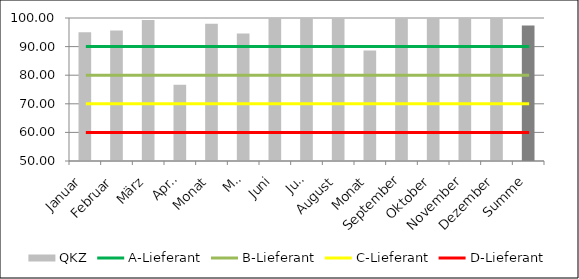
| Category | QKZ |
|---|---|
| Januar | 95 |
| Februar | 95.657 |
| März | 99.324 |
| April | 76.667 |
| Monat | 97.981 |
| Mai | 94.611 |
| Juni | 100 |
| Juli | 100 |
| August | 100 |
| Monat | 88.597 |
| September | 100 |
| Oktober | 100 |
| November | 100 |
| Dezember | 100 |
| Summe | 97.348 |